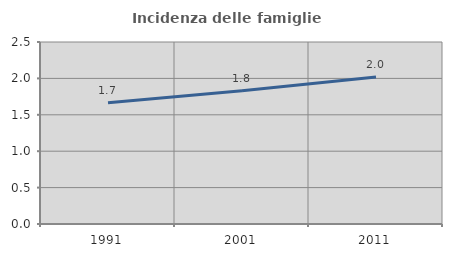
| Category | Incidenza delle famiglie numerose |
|---|---|
| 1991.0 | 1.667 |
| 2001.0 | 1.829 |
| 2011.0 | 2.02 |